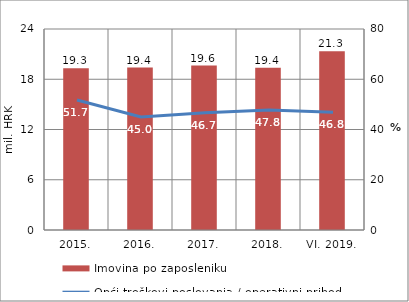
| Category | Imovina po zaposleniku |
|---|---|
| 2015. | 19.32 |
| 2016. | 19.391 |
| 2017. | 19.639 |
| 2018. | 19.378 |
| VI. 2019. | 21.339 |